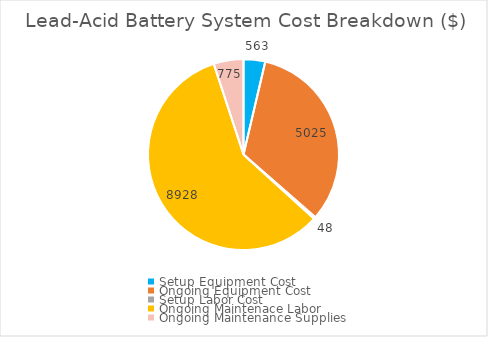
| Category | Series 0 |
|---|---|
| Setup Equipment Cost | 563 |
| Ongoing Equipment Cost | 5025 |
| Setup Labor Cost | 48 |
| Ongoing Maintenace Labor | 8928 |
| Ongoing Maintenance Supplies | 775 |